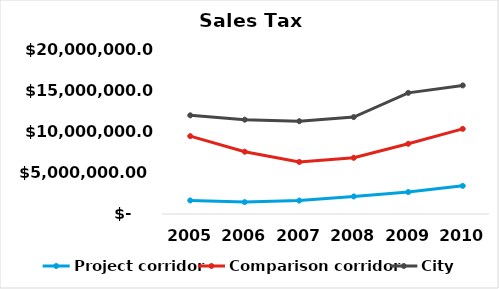
| Category | Project corridor | Comparison corridor | City |
|---|---|---|---|
| 2005.0 | 1641661 | 9433660 | 11960142.333 |
| 2006.0 | 1442547 | 7548748 | 11432133.667 |
| 2007.0 | 1627308 | 6310272 | 11247562 |
| 2008.0 | 2127308 | 6810272 | 11747562 |
| 2009.0 | 2659135 | 8512840 | 14684452.5 |
| 2010.0 | 3411670.205 | 10322244.142 | 15585721.504 |